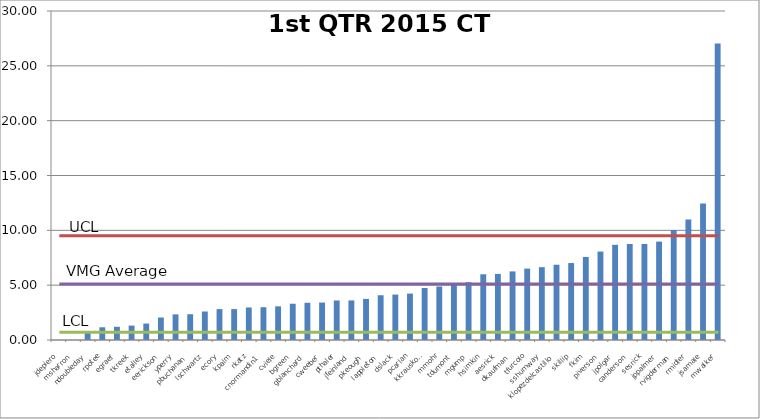
| Category | Series 0 |
|---|---|
| jdepiero | 0 |
| msharron | 0 |
| ndoubleday | 0.806 |
| rpotee | 1.16 |
| egraef | 1.203 |
| tkreek | 1.313 |
| etalley | 1.5 |
| eerickson | 2.05 |
| yperry | 2.336 |
| pbuchanan | 2.351 |
| lschwartz | 2.599 |
| ecory | 2.817 |
| kpalm | 2.817 |
| rkatz | 2.967 |
| cnormandin1 | 2.99 |
| cviele | 3.071 |
| bgreen | 3.307 |
| gblanchard | 3.395 |
| cweeber | 3.414 |
| pthaler | 3.604 |
| jfeinland | 3.609 |
| pkeough | 3.748 |
| lappleton | 4.082 |
| dslack | 4.14 |
| pcarlan | 4.233 |
| kkrauskopf | 4.739 |
| mmohr | 4.878 |
| tdumont | 5.054 |
| mgump | 5.272 |
| hsimkin | 5.994 |
| aesrick | 6.027 |
| dkaufman | 6.254 |
| tfurcolo | 6.511 |
| sshumway | 6.641 |
| klopezdelcastillo | 6.864 |
| skillip | 7.016 |
| fkim | 7.572 |
| piverson | 8.065 |
| jpolgar | 8.679 |
| canderson | 8.753 |
| sesrick | 8.753 |
| jppalmer | 8.973 |
| rvigderman | 10.027 |
| rmidler | 10.989 |
| jsamale | 12.44 |
| mwalker | 27.027 |